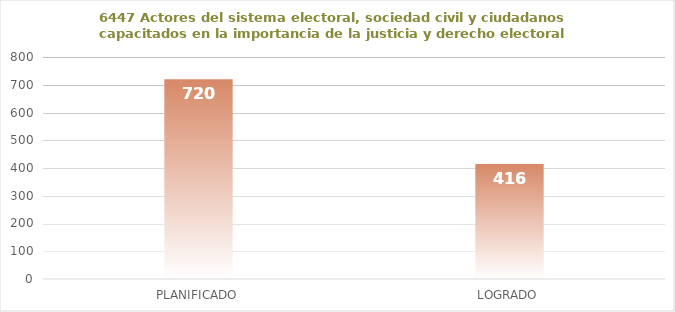
| Category | 6447 |
|---|---|
| PLANIFICADO | 720 |
| LOGRADO | 416 |